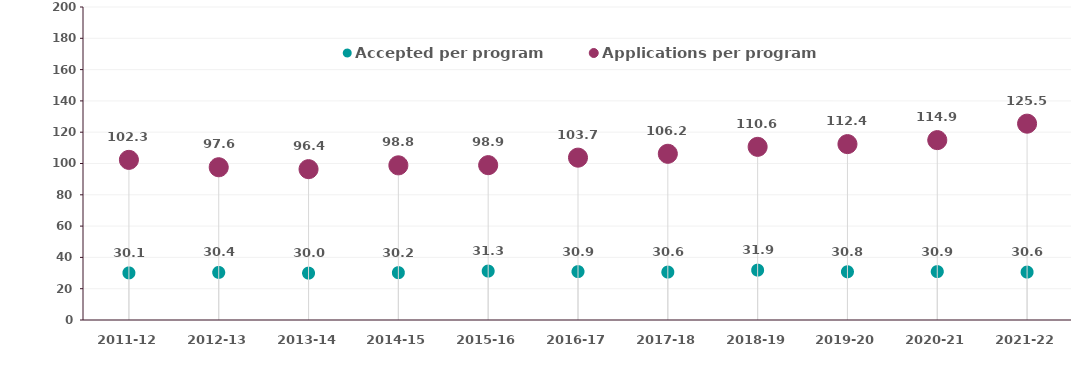
| Category | Accepted per program | Applications per program |
|---|---|---|
| 2011-12 | 30.096 | 102.325 |
| 2012-13 | 30.403 | 97.603 |
| 2013-14 | 29.955 | 96.374 |
| 2014-15 | 30.236 | 98.827 |
| 2015-16 | 31.266 | 98.937 |
| 2016-17 | 30.93 | 103.739 |
| 2017-18 | 30.62 | 106.204 |
| 2018-19 | 31.865 | 110.649 |
| 2019-20 | 30.816 | 112.383 |
| 2020-21 | 30.927 | 114.937 |
| 2021-22 | 30.613 | 125.451 |